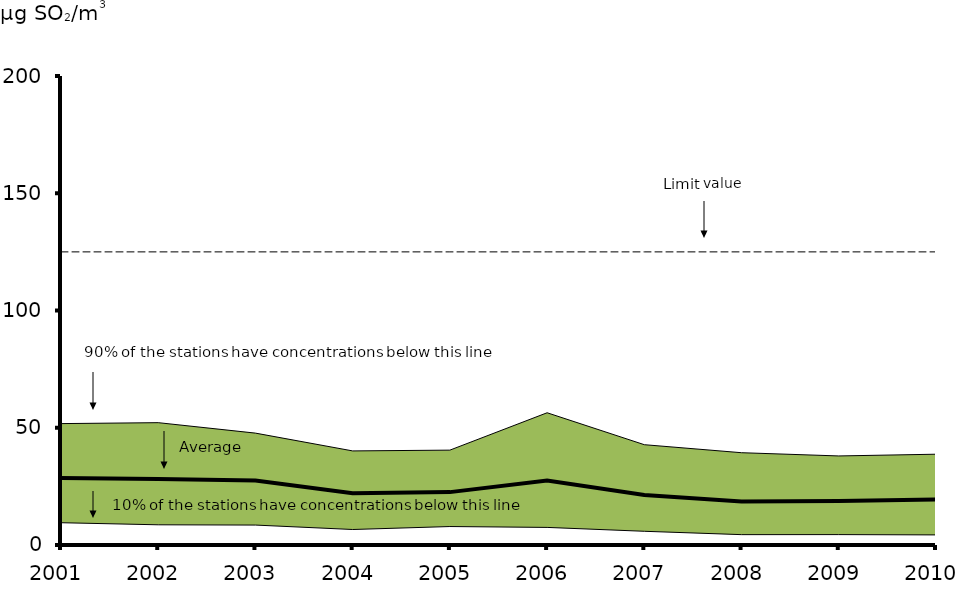
| Category | Average | Limit value |
|---|---|---|
| 2001.0 | 28.563 | 125 |
| 2002.0 | 28.123 | 125 |
| 2003.0 | 27.507 | 125 |
| 2004.0 | 22.029 | 125 |
| 2005.0 | 22.554 | 125 |
| 2006.0 | 27.52 | 125 |
| 2007.0 | 21.31 | 125 |
| 2008.0 | 18.539 | 125 |
| 2009.0 | 18.712 | 125 |
| 2010.0 | 19.367 | 125 |